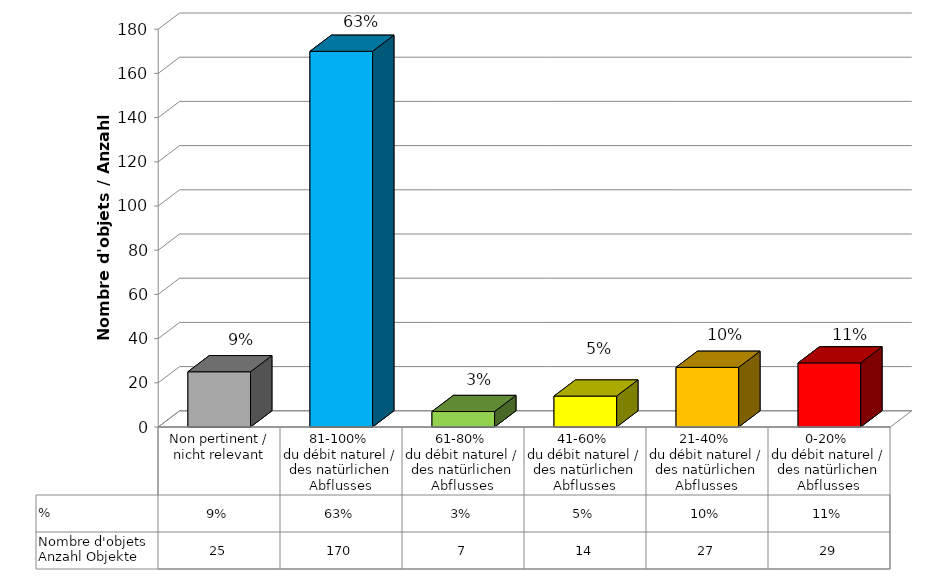
| Category | Nombre d'objets
Anzahl Objekte | % |
|---|---|---|
| Non pertinent / nicht relevant | 25 | 0.092 |
| 81-100% 
du débit naturel / des natürlichen Abflusses | 170 | 0.625 |
| 61-80% 
du débit naturel / des natürlichen Abflusses | 7 | 0.026 |
| 41-60% 
du débit naturel / des natürlichen Abflusses | 14 | 0.051 |
| 21-40% 
du débit naturel / des natürlichen Abflusses | 27 | 0.099 |
| 0-20% 
du débit naturel / des natürlichen Abflusses | 29 | 0.107 |